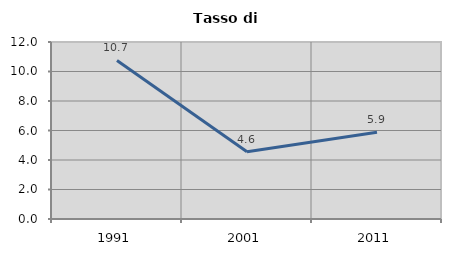
| Category | Tasso di disoccupazione   |
|---|---|
| 1991.0 | 10.748 |
| 2001.0 | 4.563 |
| 2011.0 | 5.888 |